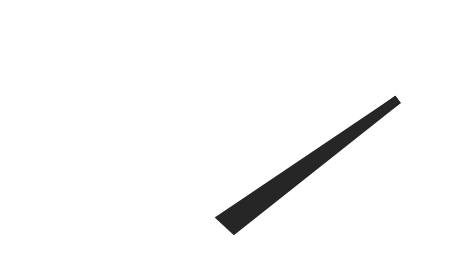
| Category | y |
|---|---|
| 87.27647454061567 | 33.324 |
| 51.33294527769017 | -1.491 |
| 48.66705472230983 | 1.491 |
| 87.27647454061567 | 33.324 |
| 50.0 | 0 |